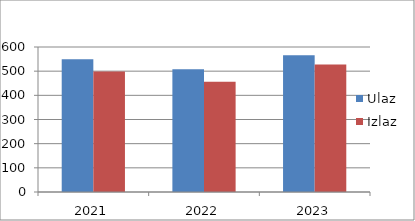
| Category | Ulaz | Izlaz |
|---|---|---|
| 2021.0 | 549 | 499 |
| 2022.0 | 508 | 456 |
| 2023.0 | 566 | 528 |